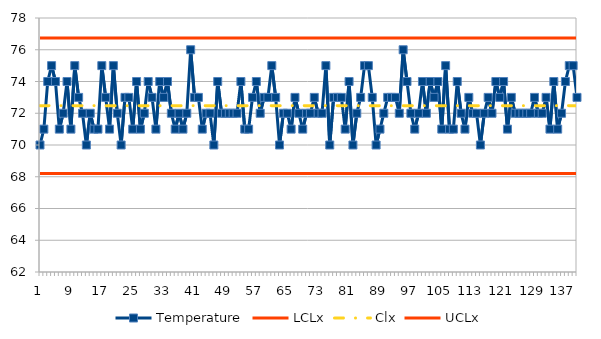
| Category | Temperature | LCLx | Clx | UCLx |
|---|---|---|---|---|
| 0 | 70 | 68.212 | 72.479 | 76.745 |
| 1 | 71 | 68.212 | 72.479 | 76.745 |
| 2 | 74 | 68.212 | 72.479 | 76.745 |
| 3 | 75 | 68.212 | 72.479 | 76.745 |
| 4 | 74 | 68.212 | 72.479 | 76.745 |
| 5 | 71 | 68.212 | 72.479 | 76.745 |
| 6 | 72 | 68.212 | 72.479 | 76.745 |
| 7 | 74 | 68.212 | 72.479 | 76.745 |
| 8 | 71 | 68.212 | 72.479 | 76.745 |
| 9 | 75 | 68.212 | 72.479 | 76.745 |
| 10 | 73 | 68.212 | 72.479 | 76.745 |
| 11 | 72 | 68.212 | 72.479 | 76.745 |
| 12 | 70 | 68.212 | 72.479 | 76.745 |
| 13 | 72 | 68.212 | 72.479 | 76.745 |
| 14 | 71 | 68.212 | 72.479 | 76.745 |
| 15 | 71 | 68.212 | 72.479 | 76.745 |
| 16 | 75 | 68.212 | 72.479 | 76.745 |
| 17 | 73 | 68.212 | 72.479 | 76.745 |
| 18 | 71 | 68.212 | 72.479 | 76.745 |
| 19 | 75 | 68.212 | 72.479 | 76.745 |
| 20 | 72 | 68.212 | 72.479 | 76.745 |
| 21 | 70 | 68.212 | 72.479 | 76.745 |
| 22 | 73 | 68.212 | 72.479 | 76.745 |
| 23 | 73 | 68.212 | 72.479 | 76.745 |
| 24 | 71 | 68.212 | 72.479 | 76.745 |
| 25 | 74 | 68.212 | 72.479 | 76.745 |
| 26 | 71 | 68.212 | 72.479 | 76.745 |
| 27 | 72 | 68.212 | 72.479 | 76.745 |
| 28 | 74 | 68.212 | 72.479 | 76.745 |
| 29 | 73 | 68.212 | 72.479 | 76.745 |
| 30 | 71 | 68.212 | 72.479 | 76.745 |
| 31 | 74 | 68.212 | 72.479 | 76.745 |
| 32 | 73 | 68.212 | 72.479 | 76.745 |
| 33 | 74 | 68.212 | 72.479 | 76.745 |
| 34 | 72 | 68.212 | 72.479 | 76.745 |
| 35 | 71 | 68.212 | 72.479 | 76.745 |
| 36 | 72 | 68.212 | 72.479 | 76.745 |
| 37 | 71 | 68.212 | 72.479 | 76.745 |
| 38 | 72 | 68.212 | 72.479 | 76.745 |
| 39 | 76 | 68.212 | 72.479 | 76.745 |
| 40 | 73 | 68.212 | 72.479 | 76.745 |
| 41 | 73 | 68.212 | 72.479 | 76.745 |
| 42 | 71 | 68.212 | 72.479 | 76.745 |
| 43 | 72 | 68.212 | 72.479 | 76.745 |
| 44 | 72 | 68.212 | 72.479 | 76.745 |
| 45 | 70 | 68.212 | 72.479 | 76.745 |
| 46 | 74 | 68.212 | 72.479 | 76.745 |
| 47 | 72 | 68.212 | 72.479 | 76.745 |
| 48 | 72 | 68.212 | 72.479 | 76.745 |
| 49 | 72 | 68.212 | 72.479 | 76.745 |
| 50 | 72 | 68.212 | 72.479 | 76.745 |
| 51 | 72 | 68.212 | 72.479 | 76.745 |
| 52 | 74 | 68.212 | 72.479 | 76.745 |
| 53 | 71 | 68.212 | 72.479 | 76.745 |
| 54 | 71 | 68.212 | 72.479 | 76.745 |
| 55 | 73 | 68.212 | 72.479 | 76.745 |
| 56 | 74 | 68.212 | 72.479 | 76.745 |
| 57 | 72 | 68.212 | 72.479 | 76.745 |
| 58 | 73 | 68.212 | 72.479 | 76.745 |
| 59 | 73 | 68.212 | 72.479 | 76.745 |
| 60 | 75 | 68.212 | 72.479 | 76.745 |
| 61 | 73 | 68.212 | 72.479 | 76.745 |
| 62 | 70 | 68.212 | 72.479 | 76.745 |
| 63 | 72 | 68.212 | 72.479 | 76.745 |
| 64 | 72 | 68.212 | 72.479 | 76.745 |
| 65 | 71 | 68.212 | 72.479 | 76.745 |
| 66 | 73 | 68.212 | 72.479 | 76.745 |
| 67 | 72 | 68.212 | 72.479 | 76.745 |
| 68 | 71 | 68.212 | 72.479 | 76.745 |
| 69 | 72 | 68.212 | 72.479 | 76.745 |
| 70 | 72 | 68.212 | 72.479 | 76.745 |
| 71 | 73 | 68.212 | 72.479 | 76.745 |
| 72 | 72 | 68.212 | 72.479 | 76.745 |
| 73 | 72 | 68.212 | 72.479 | 76.745 |
| 74 | 75 | 68.212 | 72.479 | 76.745 |
| 75 | 70 | 68.212 | 72.479 | 76.745 |
| 76 | 73 | 68.212 | 72.479 | 76.745 |
| 77 | 73 | 68.212 | 72.479 | 76.745 |
| 78 | 73 | 68.212 | 72.479 | 76.745 |
| 79 | 71 | 68.212 | 72.479 | 76.745 |
| 80 | 74 | 68.212 | 72.479 | 76.745 |
| 81 | 70 | 68.212 | 72.479 | 76.745 |
| 82 | 72 | 68.212 | 72.479 | 76.745 |
| 83 | 73 | 68.212 | 72.479 | 76.745 |
| 84 | 75 | 68.212 | 72.479 | 76.745 |
| 85 | 75 | 68.212 | 72.479 | 76.745 |
| 86 | 73 | 68.212 | 72.479 | 76.745 |
| 87 | 70 | 68.212 | 72.479 | 76.745 |
| 88 | 71 | 68.212 | 72.479 | 76.745 |
| 89 | 72 | 68.212 | 72.479 | 76.745 |
| 90 | 73 | 68.212 | 72.479 | 76.745 |
| 91 | 73 | 68.212 | 72.479 | 76.745 |
| 92 | 73 | 68.212 | 72.479 | 76.745 |
| 93 | 72 | 68.212 | 72.479 | 76.745 |
| 94 | 76 | 68.212 | 72.479 | 76.745 |
| 95 | 74 | 68.212 | 72.479 | 76.745 |
| 96 | 72 | 68.212 | 72.479 | 76.745 |
| 97 | 71 | 68.212 | 72.479 | 76.745 |
| 98 | 72 | 68.212 | 72.479 | 76.745 |
| 99 | 74 | 68.212 | 72.479 | 76.745 |
| 100 | 72 | 68.212 | 72.479 | 76.745 |
| 101 | 74 | 68.212 | 72.479 | 76.745 |
| 102 | 73 | 68.212 | 72.479 | 76.745 |
| 103 | 74 | 68.212 | 72.479 | 76.745 |
| 104 | 71 | 68.212 | 72.479 | 76.745 |
| 105 | 75 | 68.212 | 72.479 | 76.745 |
| 106 | 71 | 68.212 | 72.479 | 76.745 |
| 107 | 71 | 68.212 | 72.479 | 76.745 |
| 108 | 74 | 68.212 | 72.479 | 76.745 |
| 109 | 72 | 68.212 | 72.479 | 76.745 |
| 110 | 71 | 68.212 | 72.479 | 76.745 |
| 111 | 73 | 68.212 | 72.479 | 76.745 |
| 112 | 72 | 68.212 | 72.479 | 76.745 |
| 113 | 72 | 68.212 | 72.479 | 76.745 |
| 114 | 70 | 68.212 | 72.479 | 76.745 |
| 115 | 72 | 68.212 | 72.479 | 76.745 |
| 116 | 73 | 68.212 | 72.479 | 76.745 |
| 117 | 72 | 68.212 | 72.479 | 76.745 |
| 118 | 74 | 68.212 | 72.479 | 76.745 |
| 119 | 73 | 68.212 | 72.479 | 76.745 |
| 120 | 74 | 68.212 | 72.479 | 76.745 |
| 121 | 71 | 68.212 | 72.479 | 76.745 |
| 122 | 73 | 68.212 | 72.479 | 76.745 |
| 123 | 72 | 68.212 | 72.479 | 76.745 |
| 124 | 72 | 68.212 | 72.479 | 76.745 |
| 125 | 72 | 68.212 | 72.479 | 76.745 |
| 126 | 72 | 68.212 | 72.479 | 76.745 |
| 127 | 72 | 68.212 | 72.479 | 76.745 |
| 128 | 73 | 68.212 | 72.479 | 76.745 |
| 129 | 72 | 68.212 | 72.479 | 76.745 |
| 130 | 72 | 68.212 | 72.479 | 76.745 |
| 131 | 73 | 68.212 | 72.479 | 76.745 |
| 132 | 71 | 68.212 | 72.479 | 76.745 |
| 133 | 74 | 68.212 | 72.479 | 76.745 |
| 134 | 71 | 68.212 | 72.479 | 76.745 |
| 135 | 72 | 68.212 | 72.479 | 76.745 |
| 136 | 74 | 68.212 | 72.479 | 76.745 |
| 137 | 75 | 68.212 | 72.479 | 76.745 |
| 138 | 75 | 68.212 | 72.479 | 76.745 |
| 139 | 73 | 68.212 | 72.479 | 76.745 |